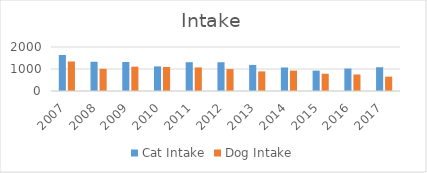
| Category | Cat Intake | Dog Intake |
|---|---|---|
| 2007.0 | 1637 | 1341 |
| 2008.0 | 1330 | 1008 |
| 2009.0 | 1317 | 1107 |
| 2010.0 | 1119 | 1091 |
| 2011.0 | 1310 | 1071 |
| 2012.0 | 1308 | 996 |
| 2013.0 | 1185 | 891 |
| 2014.0 | 1070 | 926 |
| 2015.0 | 927 | 785 |
| 2016.0 | 1021 | 750 |
| 2017.0 | 1081 | 652 |